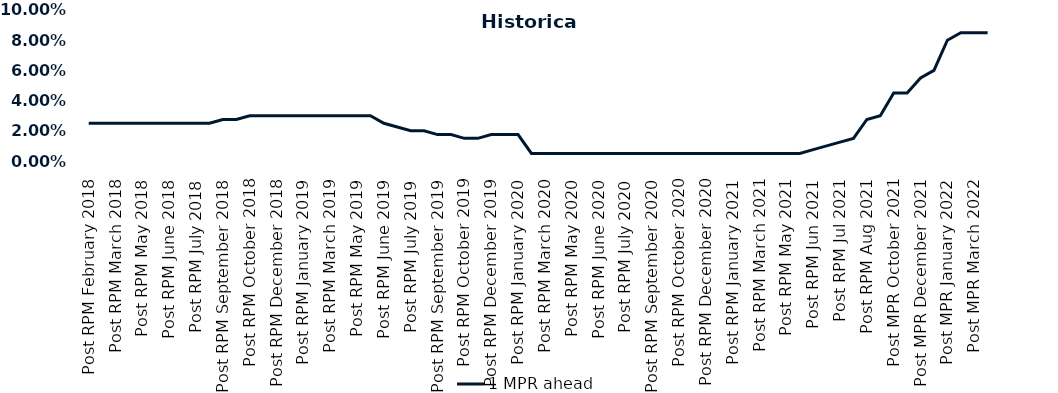
| Category | 1 MPR ahead |
|---|---|
| Post RPM February 2018 | 0.025 |
| Pre RPM March 2018 | 0.025 |
| Post RPM March 2018 | 0.025 |
| Pre RPM May 2018 | 0.025 |
| Post RPM May 2018 | 0.025 |
| Pre RPM June 2018 | 0.025 |
| Post RPM June 2018 | 0.025 |
| Pre RPM July 2018 | 0.025 |
| Post RPM July 2018 | 0.025 |
| Pre RPM September 2018 | 0.025 |
| Post RPM September 2018 | 0.028 |
| Pre RPM October 2018 | 0.028 |
| Post RPM October 2018 | 0.03 |
| Pre RPM December 2018 | 0.03 |
| Post RPM December 2018 | 0.03 |
| Pre RPM January 2019 | 0.03 |
| Post RPM January 2019 | 0.03 |
| Pre RPM March 2019 | 0.03 |
| Post RPM March 2019 | 0.03 |
| Pre RPM May 2019 | 0.03 |
| Post RPM May 2019 | 0.03 |
| Pre RPM June 2019 | 0.03 |
| Post RPM June 2019 | 0.025 |
| Pre RPM July 2019 | 0.022 |
| Post RPM July 2019 | 0.02 |
| Pre RPM September 2019 | 0.02 |
| Post RPM September 2019 | 0.018 |
| Pre RPM October 2019 | 0.018 |
| Post RPM October 2019 | 0.015 |
| Pre RPM December 2019 | 0.015 |
| Post RPM December 2019 | 0.018 |
| Pre RPM January 2020 | 0.018 |
| Post RPM January 2020 | 0.018 |
| Pre RPM March 2020 | 0.005 |
| Post RPM March 2020 | 0.005 |
| Pre RPM May 2020 | 0.005 |
| Post RPM May 2020 | 0.005 |
| Pre RPM June 2020 | 0.005 |
| Post RPM June 2020 | 0.005 |
| Pre RPM July 2020 | 0.005 |
| Post RPM July 2020 | 0.005 |
| Pre RPM September 2020 | 0.005 |
| Post RPM September 2020 | 0.005 |
| Pre RPM October 2020 | 0.005 |
| Post RPM October 2020 | 0.005 |
| Pre RPM December 2020 | 0.005 |
|  Post RPM December 2020 | 0.005 |
| Pre RPM January 2021 | 0.005 |
| Post RPM January 2021 | 0.005 |
|  Pre RPM March 2021 | 0.005 |
|  Post RPM March 2021 | 0.005 |
|  Pre RPM May 2021 | 0.005 |
|  Post RPM May 2021 | 0.005 |
|  Pre RPM Jun 2021 | 0.005 |
|   Post RPM Jun 2021 | 0.008 |
| Pre RPM Jul 2021 | 0.01 |
|  Post RPM Jul 2021 | 0.012 |
| Pre RPM Aug 2021 | 0.015 |
|  Post RPM Aug 2021 | 0.028 |
| Pre MPR October 2021 | 0.03 |
| Post MPR October 2021 | 0.045 |
| Pre MPR December 2021 | 0.045 |
| Post MPR December 2021 | 0.055 |
| Pre MPR January 2022 | 0.06 |
| Post MPR January 2022 | 0.08 |
| Pre MPR March 2022 | 0.085 |
| Post MPR March 2022 | 0.085 |
| Pre MPR May 2022 | 0.085 |